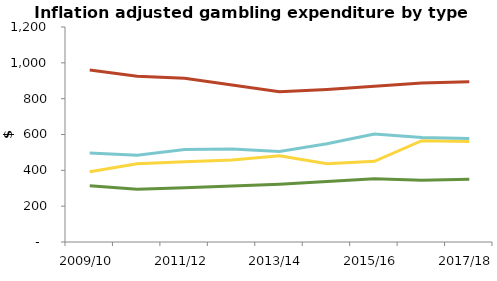
| Category | NZ Racing Board (TAB) | NZ Lotteries Commission | Gambing Machines (outside casinos) | Casinos |
|---|---|---|---|---|
| 2009/10 | 314.584 | 391.683 | 959.554 | 496.968 |
| 2010/11 | 294.616 | 436.835 | 924.587 | 484.203 |
| 2011/12 | 302.758 | 448.051 | 913.731 | 516.449 |
| 2012/13 | 311.942 | 457.733 | 876.386 | 518.948 |
| 2013/14 | 322.578 | 481.582 | 838.522 | 505.081 |
| 2014/15 | 338.053 | 437.192 | 850.838 | 548.188 |
| 2015/16 | 352.56 | 450.38 | 868.788 | 603.19 |
| 2016/17 | 344.49 | 565.744 | 887.309 | 582.999 |
| 2017/18 | 349.868 | 560.611 | 894.936 | 577.899 |